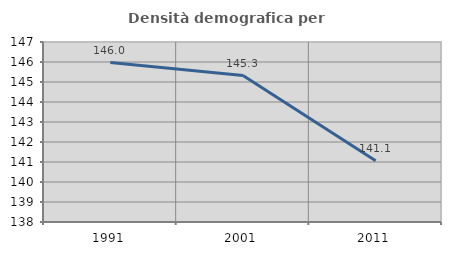
| Category | Densità demografica |
|---|---|
| 1991.0 | 145.975 |
| 2001.0 | 145.322 |
| 2011.0 | 141.057 |